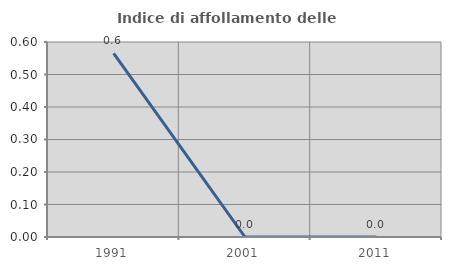
| Category | Indice di affollamento delle abitazioni  |
|---|---|
| 1991.0 | 0.565 |
| 2001.0 | 0 |
| 2011.0 | 0 |